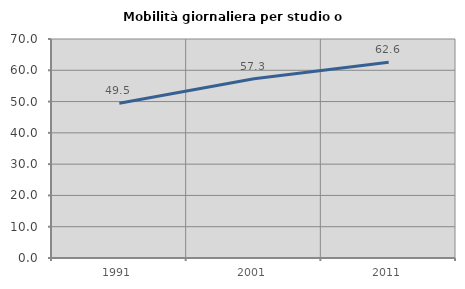
| Category | Mobilità giornaliera per studio o lavoro |
|---|---|
| 1991.0 | 49.456 |
| 2001.0 | 57.306 |
| 2011.0 | 62.604 |